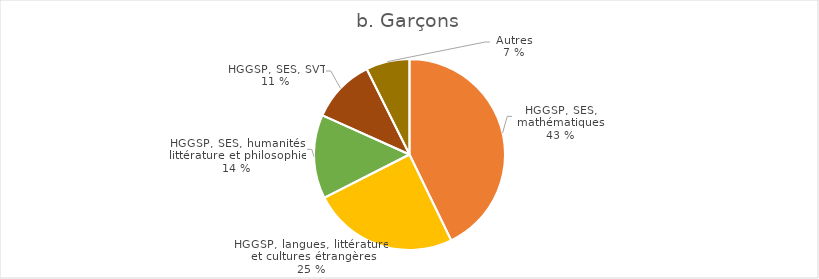
| Category | Garçons |
|---|---|
| HGGSP, SES, mathématiques | 9339 |
| HGGSP, SES, LLCER | 5392 |
| HGGSP, SES, humanités, littérature et philosophie | 3101 |
| HGGSP, SES, SVT | 2375 |
| Autres | 1612 |